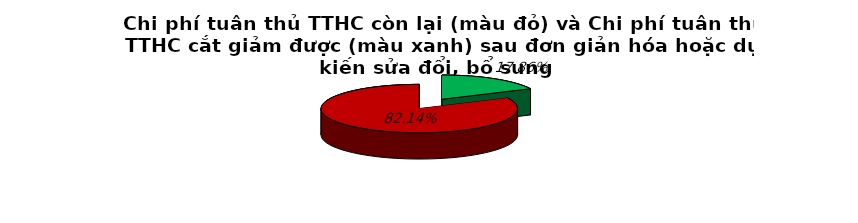
| Category | 17.9% 82.1% |
|---|---|
| 0 | 0.179 |
| 1 | 0.821 |